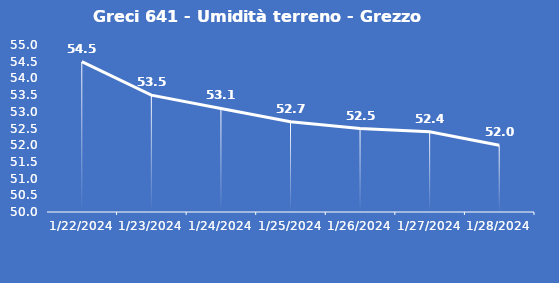
| Category | Greci 641 - Umidità terreno - Grezzo (%VWC) |
|---|---|
| 1/22/24 | 54.5 |
| 1/23/24 | 53.5 |
| 1/24/24 | 53.1 |
| 1/25/24 | 52.7 |
| 1/26/24 | 52.5 |
| 1/27/24 | 52.4 |
| 1/28/24 | 52 |